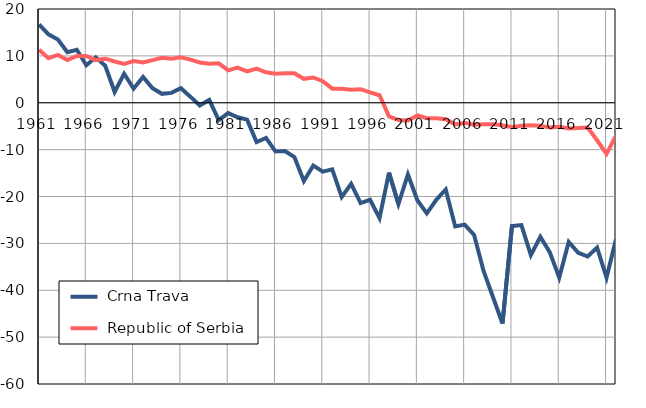
| Category |  Crna Trava |  Republic of Serbia |
|---|---|---|
| 1961.0 | 16.7 | 11.3 |
| 1962.0 | 14.6 | 9.5 |
| 1963.0 | 13.5 | 10.2 |
| 1964.0 | 10.8 | 9.1 |
| 1965.0 | 11.3 | 10 |
| 1966.0 | 8 | 10 |
| 1967.0 | 9.7 | 9.1 |
| 1968.0 | 7.9 | 9.4 |
| 1969.0 | 2.3 | 8.8 |
| 1970.0 | 6.2 | 8.3 |
| 1971.0 | 3 | 8.9 |
| 1972.0 | 5.5 | 8.6 |
| 1973.0 | 3.1 | 9.1 |
| 1974.0 | 1.9 | 9.6 |
| 1975.0 | 2.1 | 9.4 |
| 1976.0 | 3.1 | 9.7 |
| 1977.0 | 1.3 | 9.2 |
| 1978.0 | -0.6 | 8.6 |
| 1979.0 | 0.6 | 8.3 |
| 1980.0 | -3.7 | 8.4 |
| 1981.0 | -2.2 | 6.9 |
| 1982.0 | -3.1 | 7.5 |
| 1983.0 | -3.6 | 6.7 |
| 1984.0 | -8.4 | 7.3 |
| 1985.0 | -7.5 | 6.5 |
| 1986.0 | -10.4 | 6.2 |
| 1987.0 | -10.3 | 6.3 |
| 1988.0 | -11.6 | 6.3 |
| 1989.0 | -16.7 | 5.1 |
| 1990.0 | -13.4 | 5.4 |
| 1991.0 | -14.7 | 4.6 |
| 1992.0 | -14.2 | 3 |
| 1993.0 | -20.1 | 3 |
| 1994.0 | -17.3 | 2.8 |
| 1995.0 | -21.4 | 2.9 |
| 1996.0 | -20.7 | 2.2 |
| 1997.0 | -24.6 | 1.6 |
| 1998.0 | -14.9 | -2.9 |
| 1999.0 | -21.6 | -3.7 |
| 2000.0 | -15.3 | -3.8 |
| 2001.0 | -20.8 | -2.7 |
| 2002.0 | -23.6 | -3.3 |
| 2003.0 | -20.7 | -3.3 |
| 2004.0 | -18.5 | -3.5 |
| 2005.0 | -26.4 | -4.6 |
| 2006.0 | -26 | -4.3 |
| 2007.0 | -28.2 | -4.7 |
| 2008.0 | -35.9 | -4.6 |
| 2009.0 | -41.5 | -4.6 |
| 2010.0 | -47.1 | -4.8 |
| 2011.0 | -26.3 | -5.2 |
| 2012.0 | -26.1 | -4.9 |
| 2013.0 | -32.5 | -4.8 |
| 2014.0 | -28.6 | -4.9 |
| 2015.0 | -31.9 | -5.3 |
| 2016.0 | -37.3 | -5.1 |
| 2017.0 | -29.7 | -5.5 |
| 2018.0 | -32 | -5.4 |
| 2019.0 | -32.8 | -5.3 |
| 2020.0 | -30.9 | -8 |
| 2021.0 | -37.3 | -10.9 |
| 2022.0 | -29.1 | -7 |